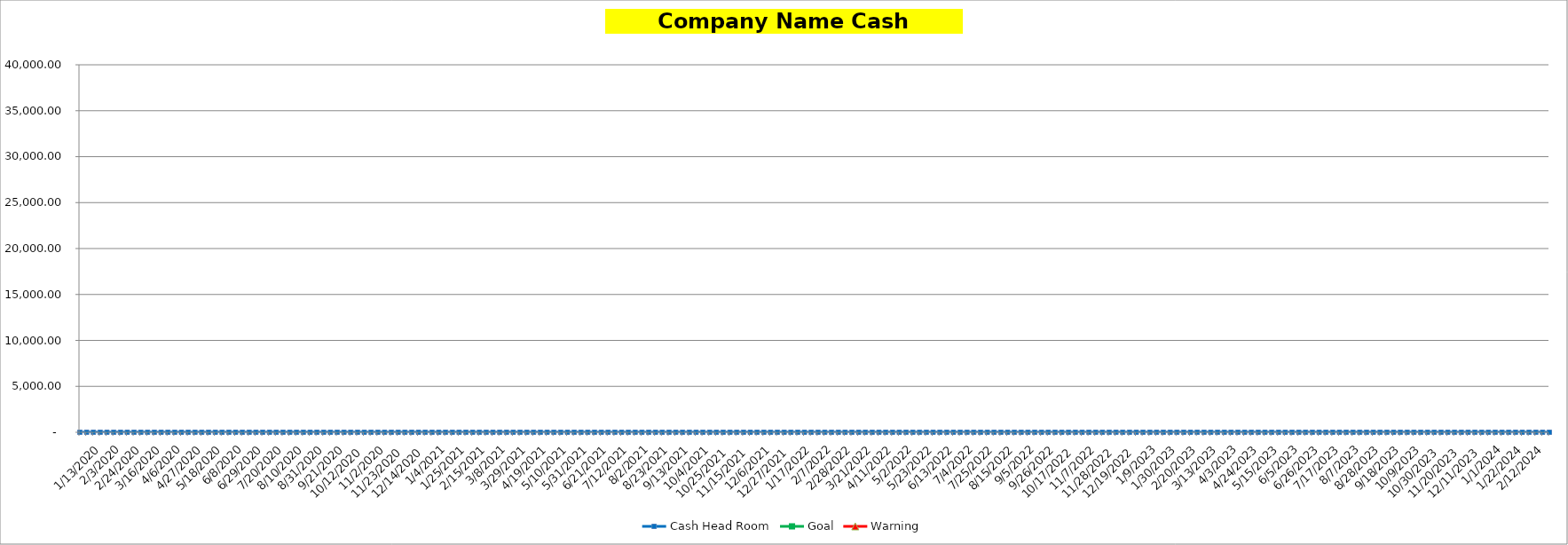
| Category |  Cash Head Room  |  Goal  |  Warning  |
|---|---|---|---|
| nan | 0 |  |  |
| 12/30/19 | 0 |  |  |
| 1/6/20 | 0 |  |  |
| 1/13/20 | 0 |  |  |
| 1/20/20 | 0 |  |  |
| 1/27/20 | 0 |  |  |
| 2/3/20 | 0 |  |  |
| 2/10/20 | 0 |  |  |
| 2/17/20 | 0 |  |  |
| 2/24/20 | 0 |  |  |
| 3/2/20 | 0 |  |  |
| 3/9/20 | 0 |  |  |
| 3/16/20 | 0 |  |  |
| 3/23/20 | 0 |  |  |
| 3/30/20 | 0 |  |  |
| 4/6/20 | 0 |  |  |
| 4/13/20 | 0 |  |  |
| 4/20/20 | 0 |  |  |
| 4/27/20 | 0 |  |  |
| 5/4/20 | 0 |  |  |
| 5/11/20 | 0 |  |  |
| 5/18/20 | 0 |  |  |
| 5/25/20 | 0 |  |  |
| 6/1/20 | 0 |  |  |
| 6/8/20 | 0 |  |  |
| 6/15/20 | 0 |  |  |
| 6/22/20 | 0 |  |  |
| 6/29/20 | 0 |  |  |
| 7/6/20 | 0 |  |  |
| 7/13/20 | 0 |  |  |
| 7/20/20 | 0 |  |  |
| 7/27/20 | 0 |  |  |
| 8/3/20 | 0 |  |  |
| 8/10/20 | 0 |  |  |
| 8/17/20 | 0 |  |  |
| 8/24/20 | 0 |  |  |
| 8/31/20 | 0 |  |  |
| 9/7/20 | 0 |  |  |
| 9/14/20 | 0 |  |  |
| 9/21/20 | 0 |  |  |
| 9/28/20 | 0 |  |  |
| 10/5/20 | 0 |  |  |
| 10/12/20 | 0 |  |  |
| 10/19/20 | 0 |  |  |
| 10/26/20 | 0 |  |  |
| 11/2/20 | 0 |  |  |
| 11/9/20 | 0 |  |  |
| 11/16/20 | 0 |  |  |
| 11/23/20 | 0 |  |  |
| 11/30/20 | 0 |  |  |
| 12/7/20 | 0 |  |  |
| 12/14/20 | 0 |  |  |
| 12/21/20 | 0 |  |  |
| 12/28/20 | 0 |  |  |
| 1/4/21 | 0 |  |  |
| 1/11/21 | 0 |  |  |
| 1/18/21 | 0 |  |  |
| 1/25/21 | 0 |  |  |
| 2/1/21 | 0 |  |  |
| 2/8/21 | 0 |  |  |
| 2/15/21 | 0 |  |  |
| 2/22/21 | 0 |  |  |
| 3/1/21 | 0 |  |  |
| 3/8/21 | 0 |  |  |
| 3/15/21 | 0 |  |  |
| 3/22/21 | 0 |  |  |
| 3/29/21 | 0 |  |  |
| 4/5/21 | 0 |  |  |
| 4/12/21 | 0 |  |  |
| 4/19/21 | 0 |  |  |
| 4/26/21 | 0 |  |  |
| 5/3/21 | 0 |  |  |
| 5/10/21 | 0 |  |  |
| 5/17/21 | 0 |  |  |
| 5/24/21 | 0 |  |  |
| 5/31/21 | 0 |  |  |
| 6/7/21 | 0 |  |  |
| 6/14/21 | 0 |  |  |
| 6/21/21 | 0 |  |  |
| 6/28/21 | 0 |  |  |
| 7/5/21 | 0 |  |  |
| 7/12/21 | 0 |  |  |
| 7/19/21 | 0 |  |  |
| 7/26/21 | 0 |  |  |
| 8/2/21 | 0 |  |  |
| 8/9/21 | 0 |  |  |
| 8/16/21 | 0 |  |  |
| 8/23/21 | 0 |  |  |
| 8/30/21 | 0 |  |  |
| 9/6/21 | 0 |  |  |
| 9/13/21 | 0 |  |  |
| 9/20/21 | 0 |  |  |
| 9/27/21 | 0 |  |  |
| 10/4/21 | 0 |  |  |
| 10/11/21 | 0 |  |  |
| 10/18/21 | 0 |  |  |
| 10/25/21 | 0 |  |  |
| 11/1/21 | 0 |  |  |
| 11/8/21 | 0 |  |  |
| 11/15/21 | 0 |  |  |
| 11/22/21 | 0 |  |  |
| 11/29/21 | 0 |  |  |
| 12/6/21 | 0 |  |  |
| 12/13/21 | 0 |  |  |
| 12/20/21 | 0 |  |  |
| 12/27/21 | 0 |  |  |
| 1/3/22 | 0 |  |  |
| 1/10/22 | 0 |  |  |
| 1/17/22 | 0 |  |  |
| 1/24/22 | 0 |  |  |
| 1/31/22 | 0 |  |  |
| 2/7/22 | 0 |  |  |
| 2/14/22 | 0 |  |  |
| 2/21/22 | 0 |  |  |
| 2/28/22 | 0 |  |  |
| 3/7/22 | 0 |  |  |
| 3/14/22 | 0 |  |  |
| 3/21/22 | 0 |  |  |
| 3/28/22 | 0 |  |  |
| 4/4/22 | 0 |  |  |
| 4/11/22 | 0 |  |  |
| 4/18/22 | 0 |  |  |
| 4/25/22 | 0 |  |  |
| 5/2/22 | 0 |  |  |
| 5/9/22 | 0 |  |  |
| 5/16/22 | 0 |  |  |
| 5/23/22 | 0 |  |  |
| 5/30/22 | 0 |  |  |
| 6/6/22 | 0 |  |  |
| 6/13/22 | 0 |  |  |
| 6/20/22 | 0 |  |  |
| 6/27/22 | 0 |  |  |
| 7/4/22 | 0 |  |  |
| 7/11/22 | 0 |  |  |
| 7/18/22 | 0 |  |  |
| 7/25/22 | 0 |  |  |
| 8/1/22 | 0 |  |  |
| 8/8/22 | 0 |  |  |
| 8/15/22 | 0 |  |  |
| 8/22/22 | 0 |  |  |
| 8/29/22 | 0 |  |  |
| 9/5/22 | 0 |  |  |
| 9/12/22 | 0 |  |  |
| 9/19/22 | 0 |  |  |
| 9/26/22 | 0 |  |  |
| 10/3/22 | 0 |  |  |
| 10/10/22 | 0 |  |  |
| 10/17/22 | 0 |  |  |
| 10/24/22 | 0 |  |  |
| 10/31/22 | 0 |  |  |
| 11/7/22 | 0 |  |  |
| 11/14/22 | 0 |  |  |
| 11/21/22 | 0 |  |  |
| 11/28/22 | 0 |  |  |
| 12/5/22 | 0 |  |  |
| 12/12/22 | 0 |  |  |
| 12/19/22 | 0 |  |  |
| 12/26/22 | 0 |  |  |
| 1/2/23 | 0 |  |  |
| 1/9/23 | 0 |  |  |
| 1/16/23 | 0 |  |  |
| 1/23/23 | 0 |  |  |
| 1/30/23 | 0 |  |  |
| 2/6/23 | 0 |  |  |
| 2/13/23 | 0 |  |  |
| 2/20/23 | 0 |  |  |
| 2/27/23 | 0 |  |  |
| 3/6/23 | 0 |  |  |
| 3/13/23 | 0 |  |  |
| 3/20/23 | 0 |  |  |
| 3/27/23 | 0 |  |  |
| 4/3/23 | 0 |  |  |
| 4/10/23 | 0 |  |  |
| 4/17/23 | 0 |  |  |
| 4/24/23 | 0 |  |  |
| 5/1/23 | 0 |  |  |
| 5/8/23 | 0 |  |  |
| 5/15/23 | 0 |  |  |
| 5/22/23 | 0 |  |  |
| 5/29/23 | 0 |  |  |
| 6/5/23 | 0 |  |  |
| 6/12/23 | 0 |  |  |
| 6/19/23 | 0 |  |  |
| 6/26/23 | 0 |  |  |
| 7/3/23 | 0 |  |  |
| 7/10/23 | 0 |  |  |
| 7/17/23 | 0 |  |  |
| 7/24/23 | 0 |  |  |
| 7/31/23 | 0 |  |  |
| 8/7/23 | 0 |  |  |
| 8/14/23 | 0 |  |  |
| 8/21/23 | 0 |  |  |
| 8/28/23 | 0 |  |  |
| 9/4/23 | 0 |  |  |
| 9/11/23 | 0 |  |  |
| 9/18/23 | 0 |  |  |
| 9/25/23 | 0 |  |  |
| 10/2/23 | 0 |  |  |
| 10/9/23 | 0 |  |  |
| 10/16/23 | 0 |  |  |
| 10/23/23 | 0 |  |  |
| 10/30/23 | 0 |  |  |
| 11/6/23 | 0 |  |  |
| 11/13/23 | 0 |  |  |
| 11/20/23 | 0 |  |  |
| 11/27/23 | 0 |  |  |
| 12/4/23 | 0 |  |  |
| 12/11/23 | 0 |  |  |
| 12/18/23 | 0 |  |  |
| 12/25/23 | 0 |  |  |
| 1/1/24 | 0 |  |  |
| 1/8/24 | 0 |  |  |
| 1/15/24 | 0 |  |  |
| 1/22/24 | 0 |  |  |
| 1/29/24 | 0 |  |  |
| 2/5/24 | 0 |  |  |
| 2/12/24 | 0 |  |  |
| 2/19/24 | 0 |  |  |